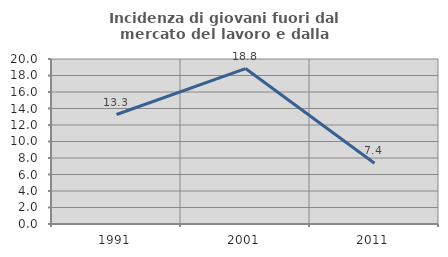
| Category | Incidenza di giovani fuori dal mercato del lavoro e dalla formazione  |
|---|---|
| 1991.0 | 13.27 |
| 2001.0 | 18.841 |
| 2011.0 | 7.362 |